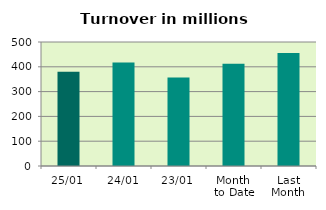
| Category | Series 0 |
|---|---|
| 25/01 | 379.997 |
| 24/01 | 417.395 |
| 23/01 | 357.124 |
| Month 
to Date | 412.037 |
| Last
Month | 455.699 |